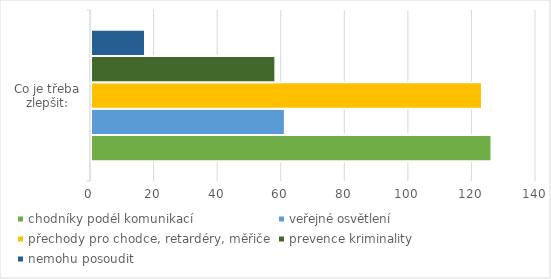
| Category | chodníky podél komunikací | veřejné osvětlení | přechody pro chodce, retardéry, měřiče | prevence kriminality | nemohu posoudit |
|---|---|---|---|---|---|
| 0 | 126 | 61 | 123 | 58 | 17 |